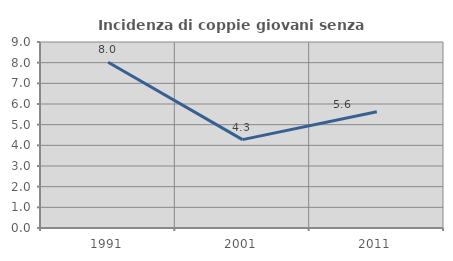
| Category | Incidenza di coppie giovani senza figli |
|---|---|
| 1991.0 | 8.02 |
| 2001.0 | 4.276 |
| 2011.0 | 5.625 |